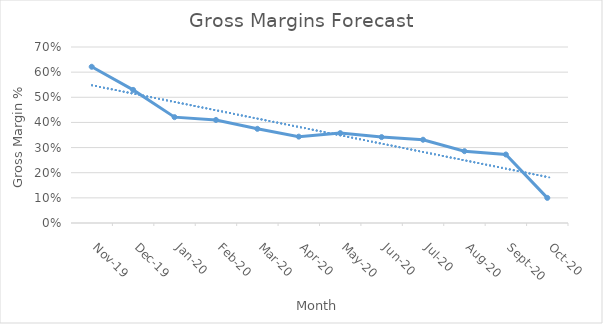
| Category | Series 0 |
|---|---|
| 2019-11-01 | 0.621 |
| 2019-12-01 | 0.529 |
| 2020-01-01 | 0.421 |
| 2020-02-01 | 0.41 |
| 2020-03-01 | 0.375 |
| 2020-04-01 | 0.343 |
| 2020-05-01 | 0.357 |
| 2020-06-01 | 0.342 |
| 2020-07-01 | 0.331 |
| 2020-08-01 | 0.286 |
| 2020-09-01 | 0.272 |
| 2020-10-01 | 0.1 |